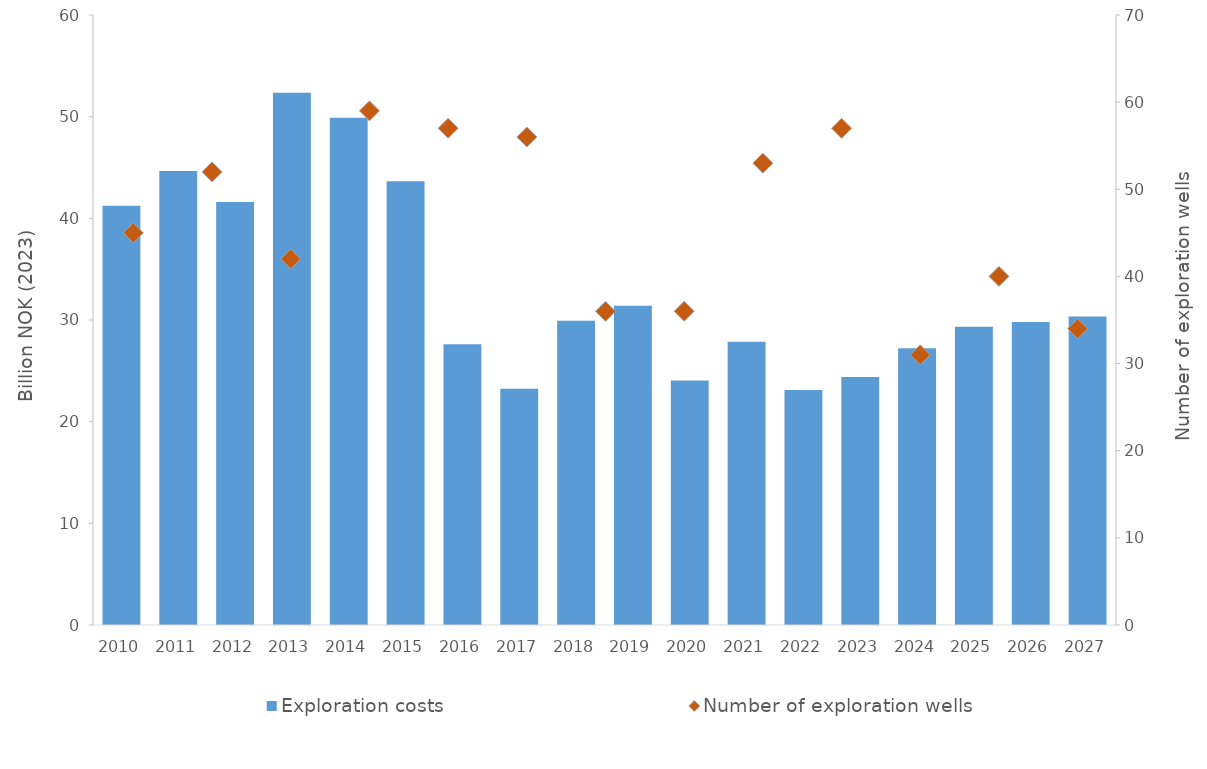
| Category | Exploration costs |
|---|---|
| 2010.0 | 41.244 |
| 2011.0 | 44.646 |
| 2012.0 | 41.599 |
| 2013.0 | 52.357 |
| 2014.0 | 49.886 |
| 2015.0 | 43.636 |
| 2016.0 | 27.606 |
| 2017.0 | 23.234 |
| 2018.0 | 29.937 |
| 2019.0 | 31.39 |
| 2020.0 | 24.049 |
| 2021.0 | 27.852 |
| 2022.0 | 23.105 |
| 2023.0 | 24.394 |
| 2024.0 | 27.219 |
| 2025.0 | 29.347 |
| 2026.0 | 29.807 |
| 2027.0 | 30.353 |